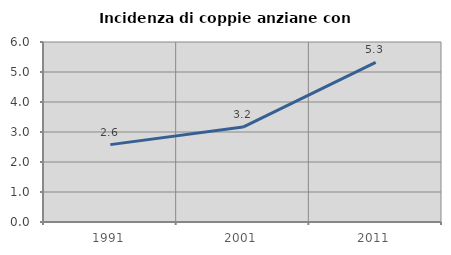
| Category | Incidenza di coppie anziane con figli |
|---|---|
| 1991.0 | 2.579 |
| 2001.0 | 3.165 |
| 2011.0 | 5.322 |